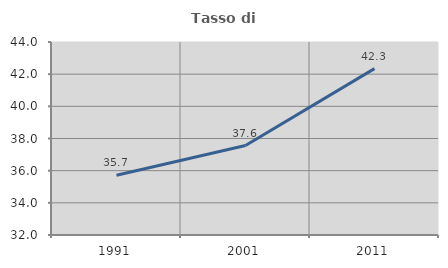
| Category | Tasso di occupazione   |
|---|---|
| 1991.0 | 35.714 |
| 2001.0 | 37.56 |
| 2011.0 | 42.345 |